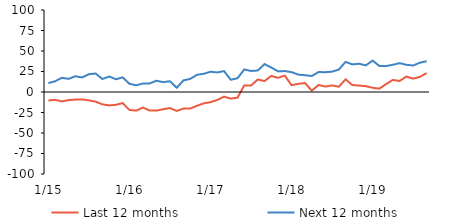
| Category | Last 12 months | Next 12 months |
|---|---|---|
|  1/15 | -10.32 | 10.88 |
|  2/15 | -9.55 | 13.1 |
|  3/15 | -11.45 | 17.32 |
|  4/15 | -9.85 | 16.04 |
|  5/15 | -9.22 | 19.19 |
|  6/15 | -8.99 | 17.77 |
|  7/15 | -10.2 | 21.74 |
|  8/15 | -11.76 | 22.49 |
|  9/15 | -15.03 | 15.86 |
|  10/15 | -16.38 | 18.89 |
|  11/15 | -15.64 | 15.55 |
|  12/15 | -13.49 | 17.84 |
|  1/16 | -21.91 | 10.03 |
|  2/16 | -22.72 | 8.16 |
|  3/16 | -18.91 | 10.34 |
|  4/16 | -22.65 | 10.48 |
|  5/16 | -22.69 | 13.73 |
|  6/16 | -21.05 | 11.99 |
|  7/16 | -19.56 | 13.15 |
|  8/16 | -23.1 | 5.15 |
|  9/16 | -20.21 | 14.17 |
|  10/16 | -20.19 | 16 |
|  11/16 | -16.81 | 20.99 |
|  12/16 | -13.84 | 22.19 |
|  1/17 | -12.4 | 24.7 |
|  2/17 | -9.79 | 23.87 |
|  3/17 | -5.67 | 25.48 |
|  4/17 | -8.04 | 14.94 |
|  5/17 | -6.9 | 16.78 |
|  6/17 | 7.95 | 27.5 |
|  7/17 | 7.9 | 25.66 |
|  8/17 | 15.28 | 26.2 |
|  9/17 | 13.3 | 34.02 |
|  10/17 | 19.64 | 29.89 |
|  11/17 | 17.29 | 25.16 |
|  12/17 | 20.01 | 25.53 |
|  1/18 | 8.26 | 24.23 |
|  2/18 | 9.94 | 21.21 |
|  3/18 | 10.91 | 20.44 |
|  4/18 | 1.56 | 19.52 |
|  5/18 | 8.57 | 24.34 |
|  6/18 | 6.65 | 24.16 |
|  7/18 | 8.04 | 24.79 |
|  8/18 | 6.42 | 27.41 |
|  9/18 | 15.48 | 36.69 |
|  10/18 | 8.47 | 33.68 |
|  11/18 | 7.83 | 34.44 |
|  12/18 | 7.09 | 32.48 |
|  1/19 | 5.17 | 38.27 |
|  2/19 | 4.08 | 31.81 |
|  3/19 | 9.64 | 31.65 |
|  4/19 | 14.75 | 33.17 |
|  5/19 | 13.42 | 35.21 |
|  6/19 | 18.83 | 33.2 |
|  7/19 | 16.3 | 32.33 |
|  8/19 | 18.42 | 35.7 |
|  9/19 | 23.07 | 37.61 |